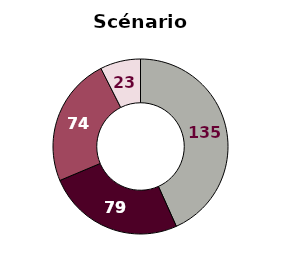
| Category | Scénario ADEME 2030-2050 |
|---|---|
| Gaz naturel | 134.908 |
| Biométhane 1G - Méthanisation | 79.084 |
| Biométhane 2G - Gazéification | 74.432 |
| Biométhane 3G - Microalgue | 0 |
| Hydrogène/Méthanation | 23.26 |